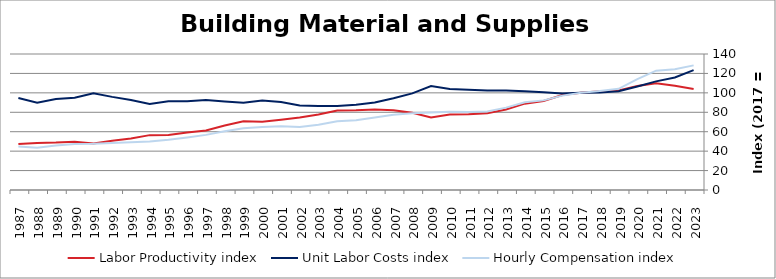
| Category | Labor Productivity index | Unit Labor Costs index | Hourly Compensation index |
|---|---|---|---|
| 2023.0 | 103.955 | 123.425 | 128.306 |
| 2022.0 | 107.246 | 115.82 | 124.212 |
| 2021.0 | 109.864 | 111.806 | 122.834 |
| 2020.0 | 107.171 | 106.522 | 114.161 |
| 2019.0 | 102.442 | 101.727 | 104.211 |
| 2018.0 | 101.652 | 100.3 | 101.956 |
| 2017.0 | 100 | 100 | 100 |
| 2016.0 | 97.709 | 99.444 | 97.167 |
| 2015.0 | 91.609 | 100.715 | 92.264 |
| 2014.0 | 88.873 | 101.736 | 90.416 |
| 2013.0 | 82.828 | 102.353 | 84.776 |
| 2012.0 | 78.923 | 102.38 | 80.801 |
| 2011.0 | 77.977 | 103.089 | 80.386 |
| 2010.0 | 77.602 | 103.936 | 80.657 |
| 2009.0 | 74.577 | 106.956 | 79.765 |
| 2008.0 | 79.503 | 99.473 | 79.084 |
| 2007.0 | 82.144 | 94.426 | 77.565 |
| 2006.0 | 82.887 | 89.993 | 74.593 |
| 2005.0 | 82.02 | 87.665 | 71.903 |
| 2004.0 | 81.829 | 86.484 | 70.769 |
| 2003.0 | 77.648 | 86.458 | 67.133 |
| 2002.0 | 74.598 | 86.917 | 64.838 |
| 2001.0 | 72.318 | 90.655 | 65.56 |
| 2000.0 | 70.188 | 92.241 | 64.743 |
| 1999.0 | 70.747 | 89.745 | 63.492 |
| 1998.0 | 66.421 | 91.14 | 60.536 |
| 1997.0 | 61.221 | 92.677 | 56.738 |
| 1996.0 | 59.194 | 91.487 | 54.155 |
| 1995.0 | 56.683 | 91.441 | 51.832 |
| 1994.0 | 56.483 | 88.559 | 50.021 |
| 1993.0 | 53.111 | 92.634 | 49.198 |
| 1992.0 | 50.593 | 95.858 | 48.498 |
| 1991.0 | 47.859 | 99.533 | 47.635 |
| 1990.0 | 49.752 | 94.934 | 47.232 |
| 1989.0 | 48.772 | 93.738 | 45.718 |
| 1988.0 | 48.505 | 89.752 | 43.534 |
| 1987.0 | 47.421 | 94.633 | 44.876 |